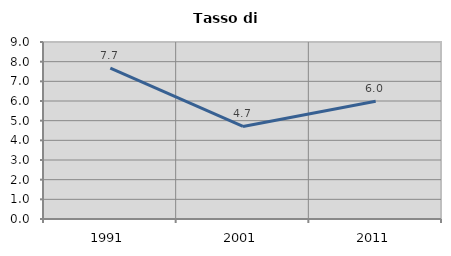
| Category | Tasso di disoccupazione   |
|---|---|
| 1991.0 | 7.668 |
| 2001.0 | 4.706 |
| 2011.0 | 5.983 |